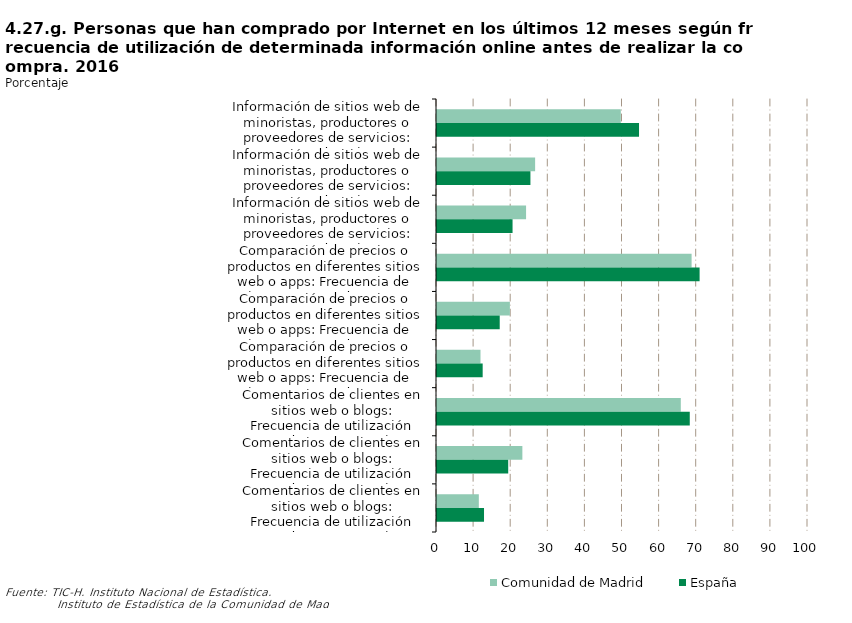
| Category | Comunidad de Madrid | España |
|---|---|---|
| Información de sitios web de minoristas, productores o proveedores de servicios: Frecuencia de utilización antes de comprar on line: siempre o casi siempre | 49.544 | 54.454 |
| Información de sitios web de minoristas, productores o proveedores de servicios: Frecuencia de utilización antes de comprar on line: algunas veces | 26.449 | 25.181 |
| Información de sitios web de minoristas, productores o proveedores de servicios: Frecuencia de utilización antes de comprar on line: nunca o casi nunca | 24.007 | 20.365 |
| Comparación de precios o productos en diferentes sitios web o apps: Frecuencia de utilización antes de comprar on line: siempre o casi siempre | 68.627 | 70.782 |
| Comparación de precios o productos en diferentes sitios web o apps: Frecuencia de utilización antes de comprar on line: algunas veces | 19.647 | 16.907 |
| Comparación de precios o productos en diferentes sitios web o apps: Frecuencia de utilización antes de comprar on line: nunca o casi nunca | 11.726 | 12.311 |
| Comentarios de clientes en sitios web o blogs: Frecuencia de utilización antes de comprar on line: siempre o casi siempre | 65.717 | 68.132 |
| Comentarios de clientes en sitios web o blogs: Frecuencia de utilización antes de comprar on line: algunas veces | 23.009 | 19.196 |
| Comentarios de clientes en sitios web o blogs: Frecuencia de utilización antes de comprar on line: nunca o casi nunca | 11.274 | 12.672 |